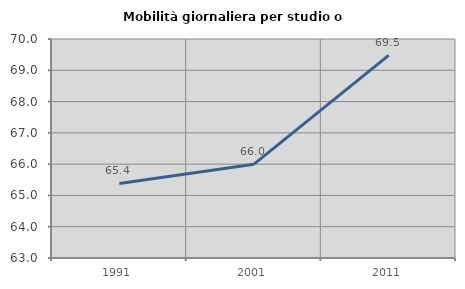
| Category | Mobilità giornaliera per studio o lavoro |
|---|---|
| 1991.0 | 65.381 |
| 2001.0 | 65.998 |
| 2011.0 | 69.478 |